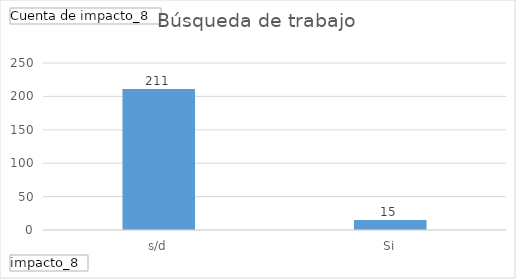
| Category | Total |
|---|---|
| s/d | 211 |
| Si | 15 |